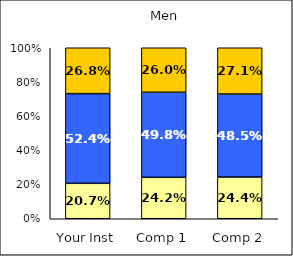
| Category | Low Sense of Belonging | Average Sense of Belonging | High Sense of Belonging |
|---|---|---|---|
| Your Inst | 0.207 | 0.524 | 0.268 |
| Comp 1 | 0.242 | 0.498 | 0.26 |
| Comp 2 | 0.244 | 0.485 | 0.271 |